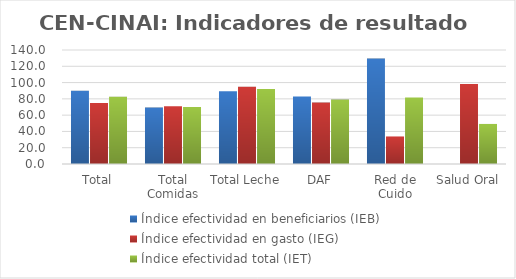
| Category | Índice efectividad en beneficiarios (IEB) | Índice efectividad en gasto (IEG)  | Índice efectividad total (IET) |
|---|---|---|---|
| Total | 90.097 | 74.954 | 82.525 |
| Total Comidas | 69.384 | 70.799 | 70.091 |
| Total Leche | 89.393 | 94.738 | 92.065 |
| DAF | 82.993 | 75.418 | 79.206 |
| Red de Cuido | 129.55 | 33.825 | 81.688 |
| Salud Oral | 0 | 98.38 | 49.19 |